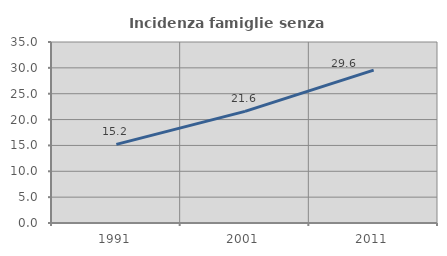
| Category | Incidenza famiglie senza nuclei |
|---|---|
| 1991.0 | 15.213 |
| 2001.0 | 21.577 |
| 2011.0 | 29.571 |